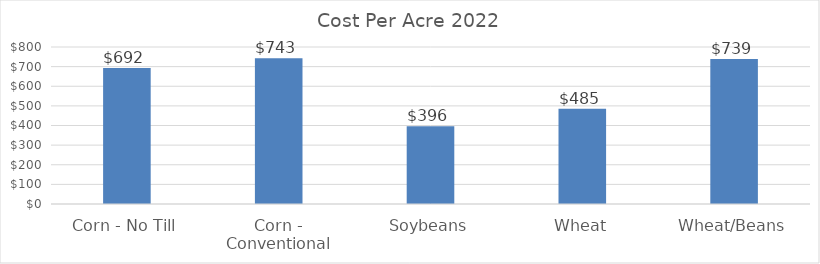
| Category | 2022 |
|---|---|
| Corn - No Till | 692.399 |
| Corn - Conventional | 742.871 |
| Soybeans | 395.878 |
| Wheat | 485.082 |
| Wheat/Beans | 739.003 |